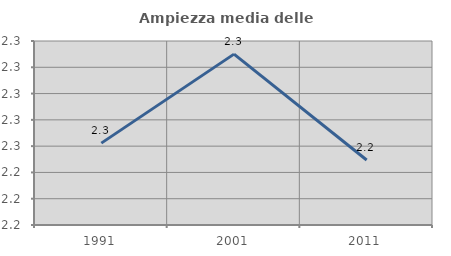
| Category | Ampiezza media delle famiglie |
|---|---|
| 1991.0 | 2.251 |
| 2001.0 | 2.285 |
| 2011.0 | 2.245 |